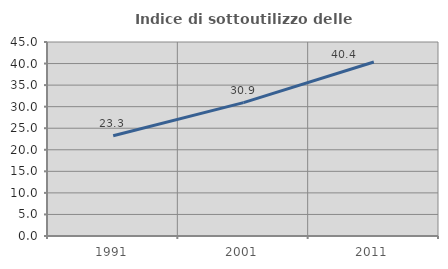
| Category | Indice di sottoutilizzo delle abitazioni  |
|---|---|
| 1991.0 | 23.259 |
| 2001.0 | 30.945 |
| 2011.0 | 40.367 |